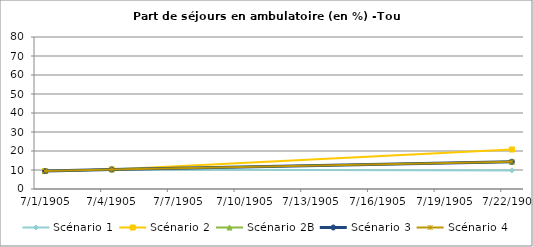
| Category | Scénario 1 | Scénario 2 | Scénario 2B | Scénario 3 | Scénario 4 |
|---|---|---|---|---|---|
| 2009.0 | 9.436 | 9.436 | 9.436 | 9.436 | 9.436 |
| 2012.0 | 10.315 | 10.315 | 10.315 | 10.315 | 10.315 |
| 2030.0 | 9.778 | 20.777 | 14.355 | 14.355 | 14.355 |